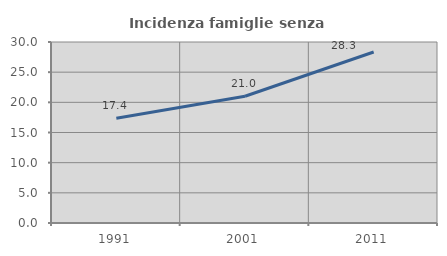
| Category | Incidenza famiglie senza nuclei |
|---|---|
| 1991.0 | 17.378 |
| 2001.0 | 21.007 |
| 2011.0 | 28.336 |